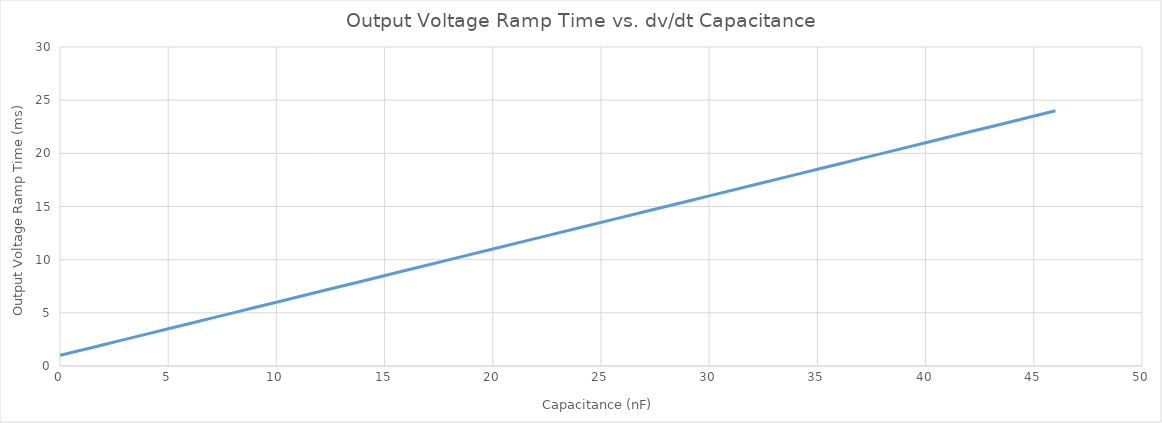
| Category | Output Voltage Ramp Time (ms) |
|---|---|
| 0.0 | 1 |
| 2.0 | 2 |
| 4.0 | 3 |
| 6.0 | 4 |
| 8.0 | 5 |
| 10.0 | 6 |
| 12.0 | 7 |
| 14.0 | 8 |
| 16.0 | 9 |
| 18.0 | 10 |
| 20.0 | 11 |
| 22.0 | 12 |
| 24.0 | 13 |
| 26.0 | 14 |
| 28.0 | 15 |
| 30.0 | 16 |
| 32.0 | 17 |
| 34.0 | 18 |
| 36.0 | 19 |
| 38.0 | 20 |
| 40.0 | 21 |
| 42.0 | 22 |
| 44.0 | 23 |
| 46.0 | 24 |